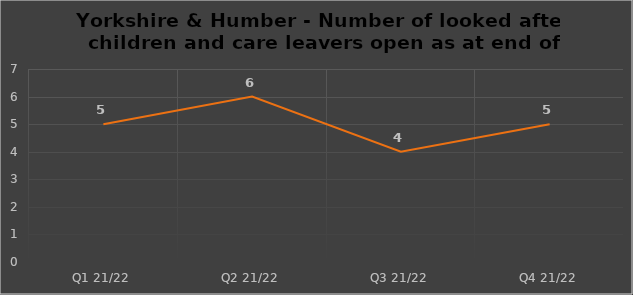
| Category | Number of open cases  |
|---|---|
| Q1 21/22 | 5 |
| Q2 21/22 | 6 |
| Q3 21/22 | 4 |
| Q4 21/22 | 5 |